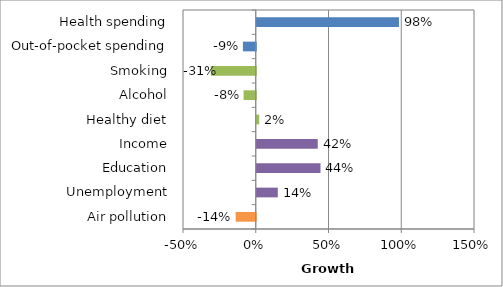
| Category | Series 0 |
|---|---|
| Air pollution | -0.138 |
| Unemployment | 0.145 |
| Education | 0.438 |
| Income | 0.419 |
| Healthy diet | 0.017 |
| Alcohol | -0.084 |
| Smoking | -0.309 |
| Out-of-pocket spending | -0.088 |
| Health spending | 0.977 |